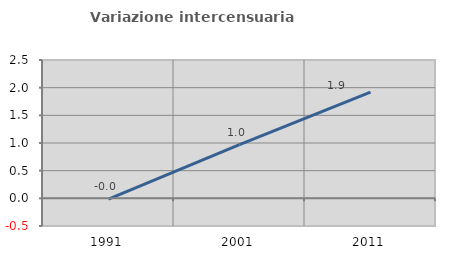
| Category | Variazione intercensuaria annua |
|---|---|
| 1991.0 | -0.015 |
| 2001.0 | 0.97 |
| 2011.0 | 1.92 |